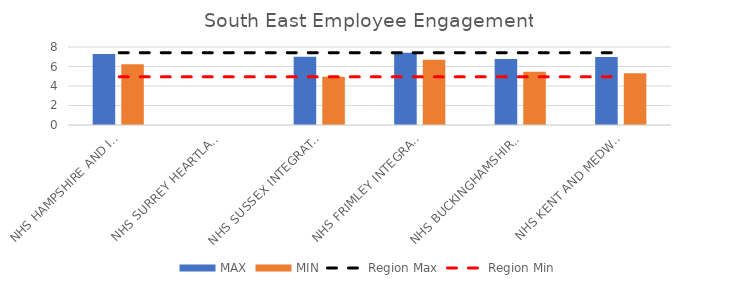
| Category | MAX | MIN |
|---|---|---|
| NHS HAMPSHIRE AND ISLE OF WIGHT INTEGRATED CARE BOARD | 7.286 | 6.238 |
| NHS SURREY HEARTLANDS INTEGRATED CARE BOARD | 0 | 0 |
| NHS SUSSEX INTEGRATED CARE BOARD | 6.997 | 4.936 |
| NHS FRIMLEY INTEGRATED CARE BOARD | 7.412 | 6.699 |
| NHS BUCKINGHAMSHIRE, OXFORDSHIRE AND BERKSHIRE WEST INTEGRATED CARE BOARD | 6.762 | 5.453 |
| NHS KENT AND MEDWAY INTEGRATED CARE BOARD | 6.98 | 5.297 |